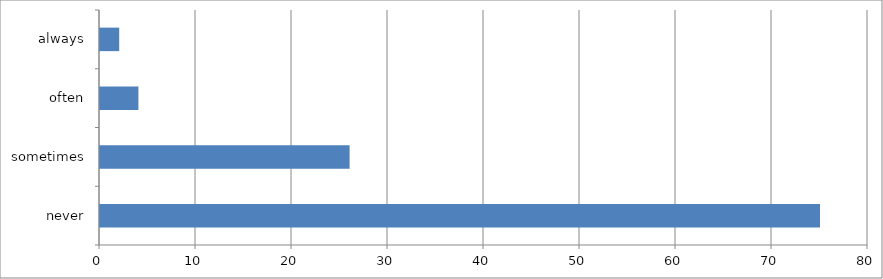
| Category | Series 0 |
|---|---|
| never | 75 |
| sometimes | 26 |
| often | 4 |
| always | 2 |